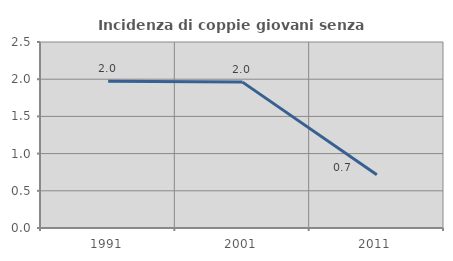
| Category | Incidenza di coppie giovani senza figli |
|---|---|
| 1991.0 | 1.974 |
| 2001.0 | 1.961 |
| 2011.0 | 0.714 |